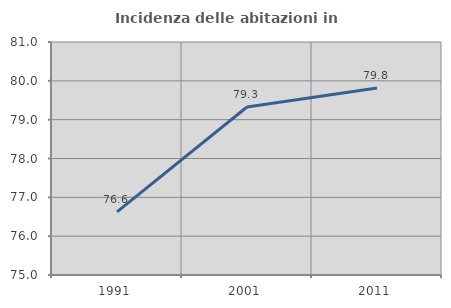
| Category | Incidenza delle abitazioni in proprietà  |
|---|---|
| 1991.0 | 76.627 |
| 2001.0 | 79.326 |
| 2011.0 | 79.813 |